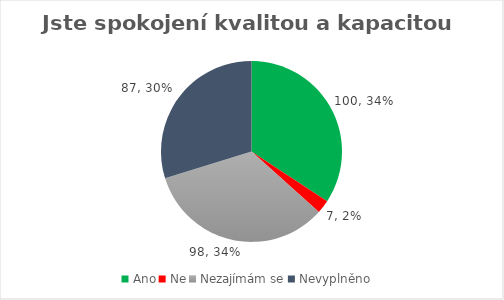
| Category | Series 0 |
|---|---|
| Ano | 100 |
| Ne | 7 |
| Nezajímám se | 98 |
| Nevyplněno | 87 |